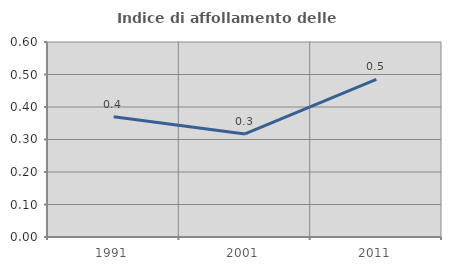
| Category | Indice di affollamento delle abitazioni  |
|---|---|
| 1991.0 | 0.37 |
| 2001.0 | 0.317 |
| 2011.0 | 0.485 |